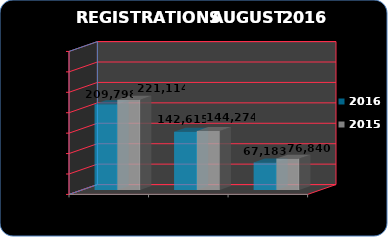
| Category | 2016 | 2015 |
|---|---|---|
| Total Registrations | 209798 | 221114 |
| No-Residentes | 142615 | 144274 |
| Residentes | 67183 | 76840 |